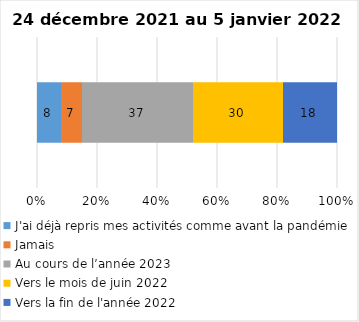
| Category | J'ai déjà repris mes activités comme avant la pandémie | Jamais | Au cours de l’année 2023 | Vers le mois de juin 2022 | Vers la fin de l'année 2022 |
|---|---|---|---|---|---|
| 0 | 8 | 7 | 37 | 30 | 18 |